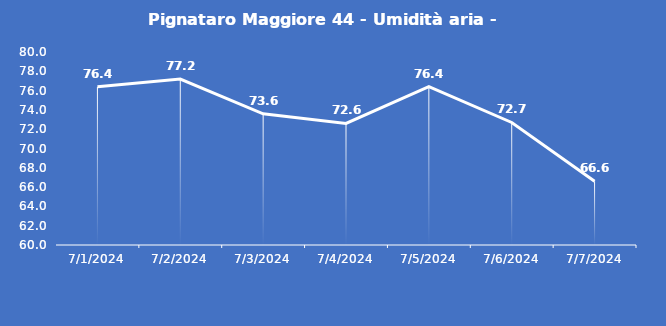
| Category | Pignataro Maggiore 44 - Umidità aria - Grezzo (%) |
|---|---|
| 7/1/24 | 76.4 |
| 7/2/24 | 77.2 |
| 7/3/24 | 73.6 |
| 7/4/24 | 72.6 |
| 7/5/24 | 76.4 |
| 7/6/24 | 72.7 |
| 7/7/24 | 66.6 |